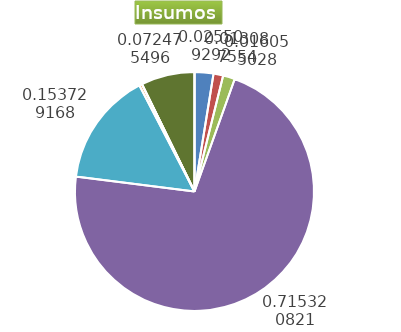
| Category | Series 0 |
|---|---|
| Control arvenses | 725952 |
| Control fitosanitario | 372450 |
| Cosecha y beneficio | 456899.363 |
| Fertilización | 20356840 |
| Instalación | 4374876.268 |
| Otros | 108786 |
| Podas | 0 |
| Riego | 0 |
| Transporte | 2062532 |
| Tutorado | 0 |